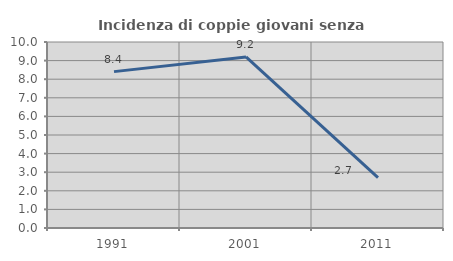
| Category | Incidenza di coppie giovani senza figli |
|---|---|
| 1991.0 | 8.407 |
| 2001.0 | 9.195 |
| 2011.0 | 2.712 |